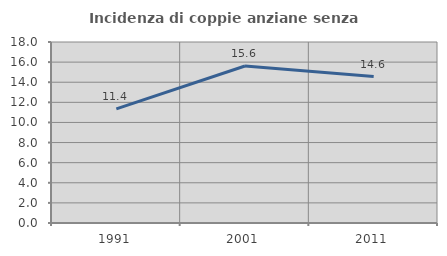
| Category | Incidenza di coppie anziane senza figli  |
|---|---|
| 1991.0 | 11.357 |
| 2001.0 | 15.613 |
| 2011.0 | 14.558 |